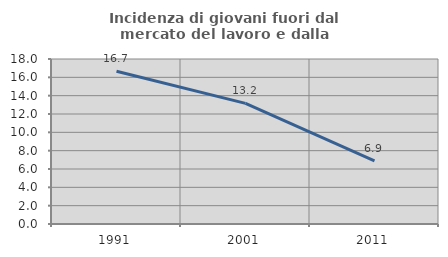
| Category | Incidenza di giovani fuori dal mercato del lavoro e dalla formazione  |
|---|---|
| 1991.0 | 16.667 |
| 2001.0 | 13.158 |
| 2011.0 | 6.897 |